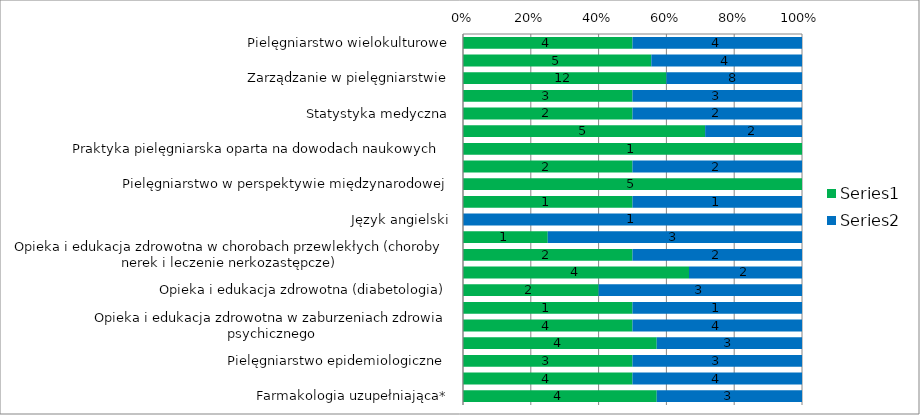
| Category | Series 0 | Series 1 |
|---|---|---|
| Pielęgniarstwo wielokulturowe | 4 | 4 |
| Prawo w praktyce pielęgniarskiej | 5 | 4 |
| Zarządzanie w pielęgniarstwie | 12 | 8 |
| Badania naukowe w pielęgniarstwie | 3 | 3 |
| Statystyka medyczna | 2 | 2 |
| Psychologia zdrowia  | 5 | 2 |
| Praktyka pielęgniarska oparta na dowodach naukowych  | 1 | 0 |
| Informacja naukowa | 2 | 2 |
| Pielęgniarstwo w perspektywie międzynarodowej | 5 | 0 |
| Seminarium dyplomowe | 1 | 1 |
| Język angielski | 0 | 1 |
| Opieka i edukacja zdrowotna w chorobach przewlekłych (choroby kardiologiczne) | 1 | 3 |
| Opieka i edukacja zdrowotna w chorobach przewlekłych (choroby nerek i leczenie nerkozastępcze)  | 2 | 2 |
| Opieka i edukacja zdrowotna w chorobach przewlekłych (choroby układu oddechowego) | 4 | 2 |
| Opieka i edukacja zdrowotna (diabetologia) | 2 | 3 |
| Opieka i edukacja zdrowotna w zaburzeniach układu nerwowego | 1 | 1 |
| Opieka i edukacja zdrowotna w zaburzeniach zdrowia psychicznego | 4 | 4 |
| Opieka i edukacja zdrowotna w chorobach przewlekłych  nowotworowych  | 4 | 3 |
| Pielęgniarstwo epidemiologiczne  | 3 | 3 |
| Farmakologia i ordynowanie produktów leczniczych | 4 | 4 |
| Farmakologia uzupełniająca* | 4 | 3 |